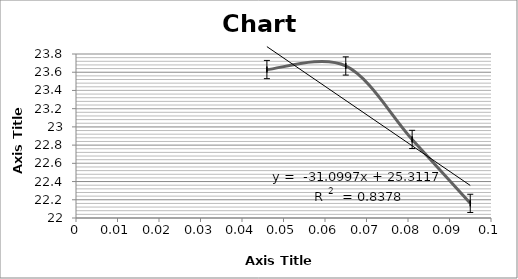
| Category | Series 0 |
|---|---|
| 0.046 | 23.629 |
| 0.065 | 23.669 |
| 0.081 | 22.862 |
| 0.095 | 22.161 |